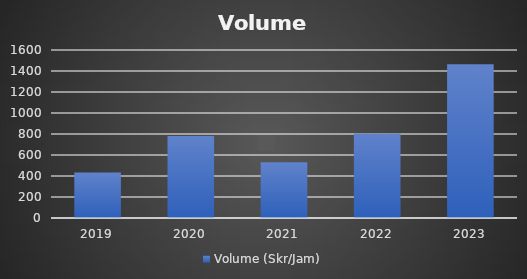
| Category | Volume (Skr/Jam) |
|---|---|
| 2019.0 | 433.99 |
| 2020.0 | 780.215 |
| 2021.0 | 530.075 |
| 2022.0 | 803.5 |
| 2023.0 | 1464.981 |